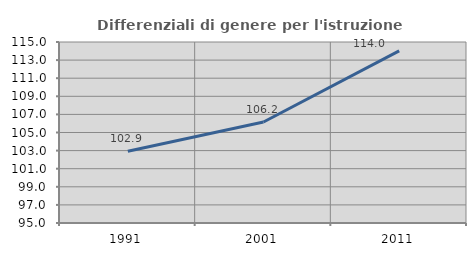
| Category | Differenziali di genere per l'istruzione superiore |
|---|---|
| 1991.0 | 102.936 |
| 2001.0 | 106.161 |
| 2011.0 | 114.019 |